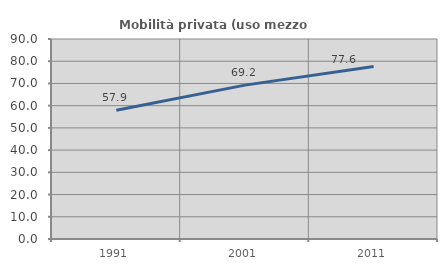
| Category | Mobilità privata (uso mezzo privato) |
|---|---|
| 1991.0 | 57.945 |
| 2001.0 | 69.238 |
| 2011.0 | 77.592 |